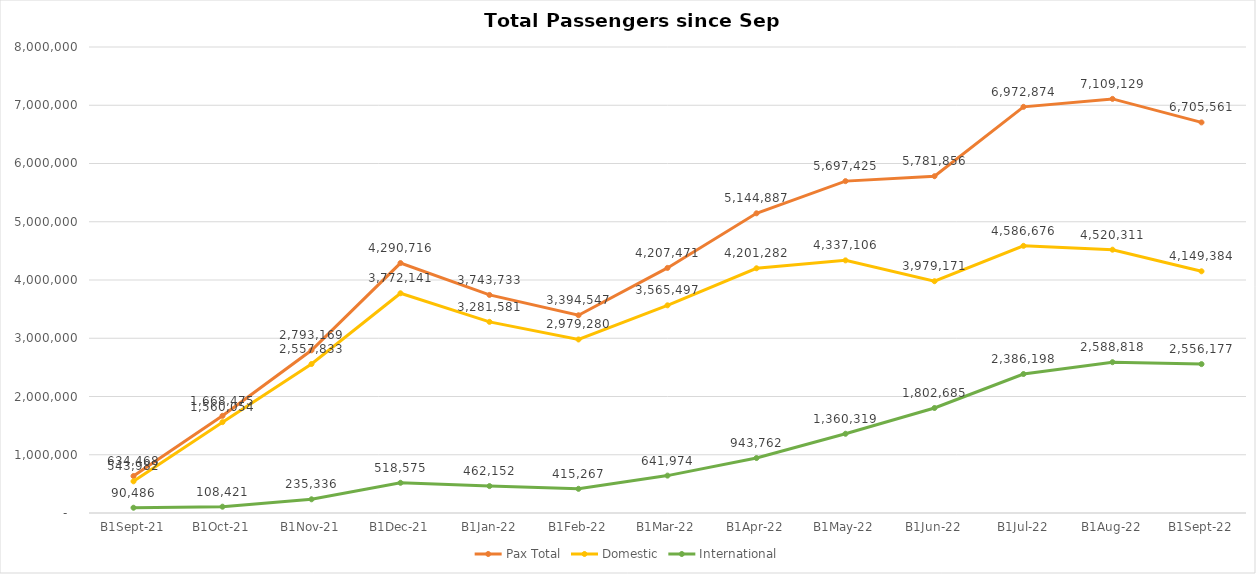
| Category | Pax Total |  Domestic  |  International  |
|---|---|---|---|
| 2021-09-01 | 634468 | 543982 | 90486 |
| 2021-10-01 | 1668475 | 1560054 | 108421 |
| 2021-11-01 | 2793169 | 2557833 | 235336 |
| 2021-12-01 | 4290716 | 3772141 | 518575 |
| 2022-01-01 | 3743733 | 3281581 | 462152 |
| 2022-02-01 | 3394547 | 2979280 | 415267 |
| 2022-03-01 | 4207471 | 3565497 | 641974 |
| 2022-04-01 | 5144887 | 4201282 | 943762 |
| 2022-05-01 | 5697425 | 4337106 | 1360319 |
| 2022-06-01 | 5781856 | 3979171 | 1802685 |
| 2022-07-01 | 6972874 | 4586676 | 2386198 |
| 2022-08-01 | 7109129 | 4520311 | 2588818 |
| 2022-09-01 | 6705561 | 4149384 | 2556177 |